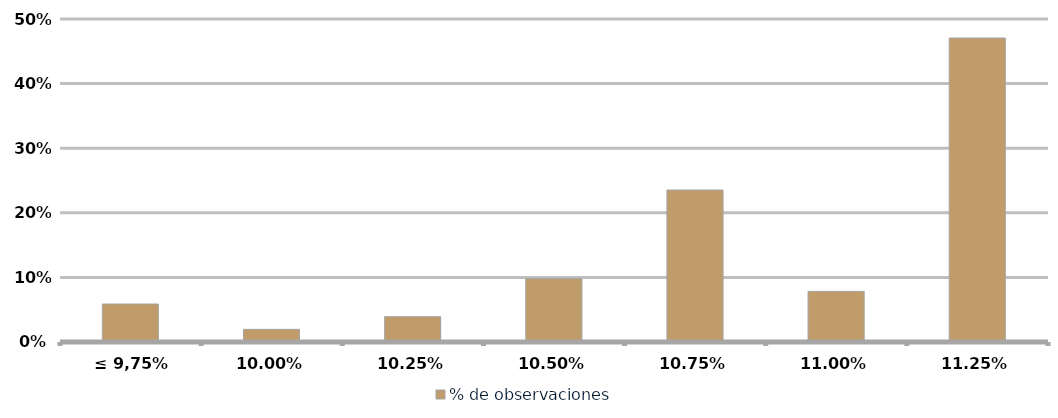
| Category | % de observaciones  |
|---|---|
| ≤ 9,75% | 0.059 |
| 10,00% | 0.02 |
| 10,25% | 0.039 |
| 10,50% | 0.098 |
| 10,75% | 0.235 |
| 11,00% | 0.078 |
| 11,25% | 0.471 |